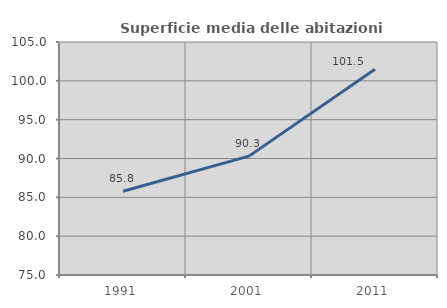
| Category | Superficie media delle abitazioni occupate |
|---|---|
| 1991.0 | 85.78 |
| 2001.0 | 90.305 |
| 2011.0 | 101.493 |